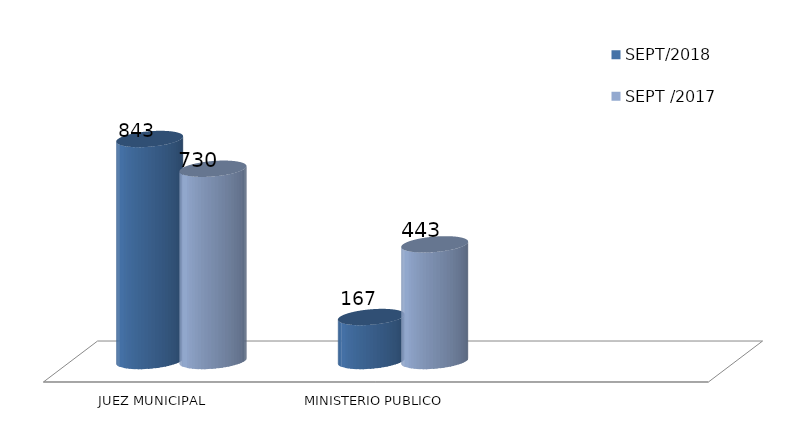
| Category | SEPT/2018 | SEPT /2017 |
|---|---|---|
| JUEZ MUNICIPAL | 843 | 730 |
| MINISTERIO PUBLICO | 167 | 443 |